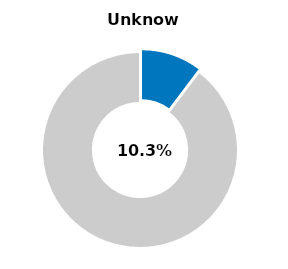
| Category | Series 0 |
|---|---|
| Unknown | 0.103 |
| Other | 0.897 |